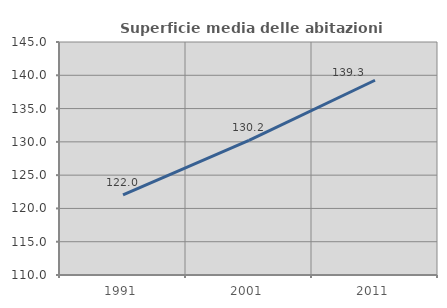
| Category | Superficie media delle abitazioni occupate |
|---|---|
| 1991.0 | 122.018 |
| 2001.0 | 130.219 |
| 2011.0 | 139.257 |